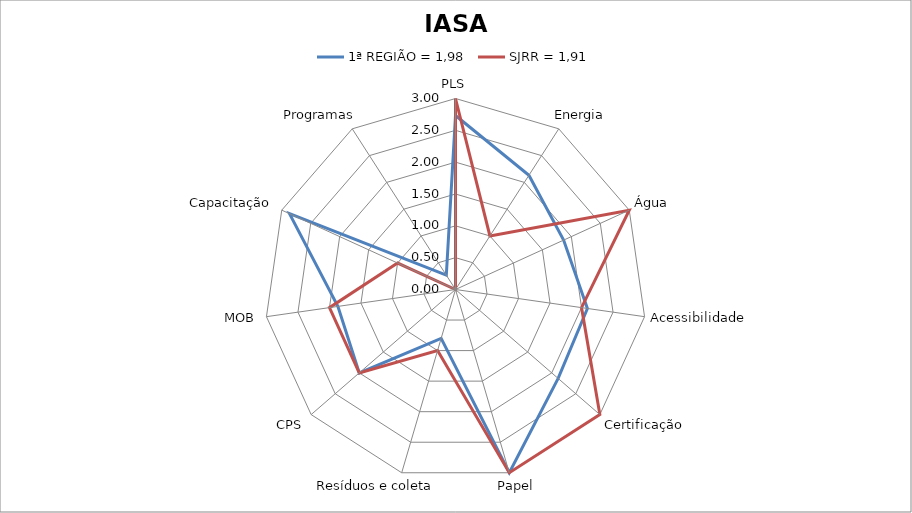
| Category | 1ª REGIÃO = 1,98 | SJRR = 1,91 |
|---|---|---|
| PLS | 2.733 | 3 |
| Energia | 2.133 | 1 |
| Água | 1.867 | 3 |
| Acessibilidade | 2.093 | 2 |
| Certificação | 2.133 | 3 |
| Papel | 3 | 3 |
| Resíduos e coleta | 0.8 | 1 |
| CPS | 2 | 2 |
| MOB | 1.867 | 2 |
| Capacitação | 2.867 | 1 |
| Programas | 0.267 | 0 |